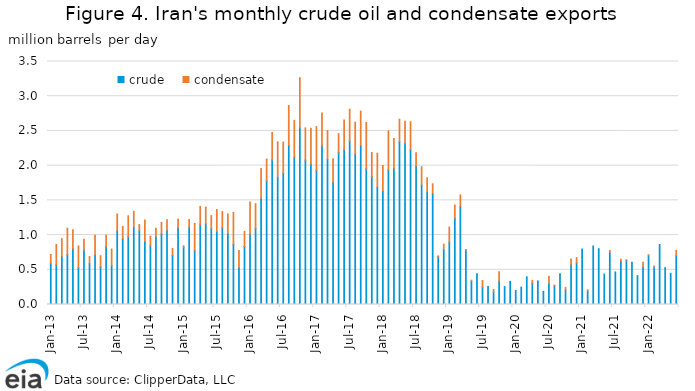
| Category | crude | condensate |
|---|---|---|
| 2013-01-01 | 0.588 | 0.132 |
| 2013-02-01 | 0.572 | 0.293 |
| 2013-03-01 | 0.693 | 0.255 |
| 2013-04-01 | 0.719 | 0.381 |
| 2013-05-01 | 0.801 | 0.275 |
| 2013-06-01 | 0.532 | 0.311 |
| 2013-07-01 | 0.788 | 0.152 |
| 2013-08-01 | 0.588 | 0.103 |
| 2013-09-01 | 0.717 | 0.282 |
| 2013-10-01 | 0.541 | 0.162 |
| 2013-11-01 | 0.832 | 0.165 |
| 2013-12-01 | 0.559 | 0.239 |
| 2014-01-01 | 1.065 | 0.239 |
| 2014-02-01 | 0.951 | 0.175 |
| 2014-03-01 | 0.978 | 0.3 |
| 2014-04-01 | 1.114 | 0.228 |
| 2014-05-01 | 1.069 | 0.083 |
| 2014-06-01 | 0.909 | 0.308 |
| 2014-07-01 | 0.843 | 0.141 |
| 2014-08-01 | 0.975 | 0.124 |
| 2014-09-01 | 1.018 | 0.164 |
| 2014-10-01 | 1.071 | 0.15 |
| 2014-11-01 | 0.708 | 0.099 |
| 2014-12-01 | 1.104 | 0.126 |
| 2015-01-01 | 0.822 | 0.024 |
| 2015-02-01 | 1.114 | 0.109 |
| 2015-03-01 | 0.778 | 0.389 |
| 2015-04-01 | 1.148 | 0.265 |
| 2015-05-01 | 1.161 | 0.243 |
| 2015-06-01 | 1.092 | 0.188 |
| 2015-07-01 | 1.05 | 0.318 |
| 2015-08-01 | 1.106 | 0.232 |
| 2015-09-01 | 1.023 | 0.281 |
| 2015-10-01 | 0.867 | 0.46 |
| 2015-11-01 | 0.531 | 0.247 |
| 2015-12-01 | 0.835 | 0.219 |
| 2016-01-01 | 1.016 | 0.459 |
| 2016-02-01 | 1.096 | 0.356 |
| 2016-03-01 | 1.531 | 0.428 |
| 2016-04-01 | 1.78 | 0.315 |
| 2016-05-01 | 2.083 | 0.395 |
| 2016-06-01 | 1.833 | 0.51 |
| 2016-07-01 | 1.891 | 0.448 |
| 2016-08-01 | 2.293 | 0.573 |
| 2016-09-01 | 2.121 | 0.531 |
| 2016-10-01 | 2.543 | 0.724 |
| 2016-11-01 | 2.079 | 0.464 |
| 2016-12-01 | 2.022 | 0.516 |
| 2017-01-01 | 1.932 | 0.631 |
| 2017-02-01 | 2.285 | 0.472 |
| 2017-03-01 | 2.091 | 0.415 |
| 2017-04-01 | 1.76 | 0.339 |
| 2017-05-01 | 2.191 | 0.269 |
| 2017-06-01 | 2.23 | 0.426 |
| 2017-07-01 | 2.355 | 0.457 |
| 2017-08-01 | 2.164 | 0.462 |
| 2017-09-01 | 2.287 | 0.499 |
| 2017-10-01 | 1.957 | 0.666 |
| 2017-11-01 | 1.842 | 0.347 |
| 2017-12-01 | 1.69 | 0.489 |
| 2018-01-01 | 1.634 | 0.366 |
| 2018-02-01 | 1.938 | 0.562 |
| 2018-03-01 | 1.958 | 0.432 |
| 2018-04-01 | 2.346 | 0.323 |
| 2018-05-01 | 2.322 | 0.317 |
| 2018-06-01 | 2.231 | 0.401 |
| 2018-07-01 | 1.993 | 0.193 |
| 2018-08-01 | 1.719 | 0.266 |
| 2018-09-01 | 1.622 | 0.204 |
| 2018-10-01 | 1.597 | 0.141 |
| 2018-11-01 | 0.69 | 0.011 |
| 2018-12-01 | 0.792 | 0.076 |
| 2019-01-01 | 0.9 | 0.216 |
| 2019-02-01 | 1.244 | 0.189 |
| 2019-03-01 | 1.413 | 0.166 |
| 2019-04-01 | 0.782 | 0.011 |
| 2019-05-01 | 0.332 | 0.019 |
| 2019-06-01 | 0.442 | 0 |
| 2019-07-01 | 0.252 | 0.094 |
| 2019-08-01 | 0.26 | 0 |
| 2019-09-01 | 0.179 | 0.04 |
| 2019-10-01 | 0.337 | 0.134 |
| 2019-11-01 | 0.258 | 0 |
| 2019-12-01 | 0.333 | 0 |
| 2020-01-01 | 0.202 | 0 |
| 2020-02-01 | 0.25 | 0 |
| 2020-03-01 | 0.399 | 0 |
| 2020-04-01 | 0.307 | 0.041 |
| 2020-05-01 | 0.339 | 0 |
| 2020-06-01 | 0.189 | 0 |
| 2020-07-01 | 0.303 | 0.104 |
| 2020-08-01 | 0.268 | 0.011 |
| 2020-09-01 | 0.444 | 0 |
| 2020-10-01 | 0.209 | 0.038 |
| 2020-11-01 | 0.577 | 0.079 |
| 2020-12-01 | 0.6 | 0.075 |
| 2021-01-01 | 0.8 | 0 |
| 2021-02-01 | 0.19 | 0.022 |
| 2021-03-01 | 0.843 | 0 |
| 2021-04-01 | 0.804 | 0 |
| 2021-05-01 | 0.438 | 0 |
| 2021-06-01 | 0.752 | 0.027 |
| 2021-07-01 | 0.469 | 0 |
| 2021-08-01 | 0.624 | 0.029 |
| 2021-09-01 | 0.636 | 0.007 |
| 2021-10-01 | 0.608 | 0 |
| 2021-11-01 | 0.415 | 0 |
| 2021-12-01 | 0.539 | 0.071 |
| 2022-01-01 | 0.7 | 0.017 |
| 2022-02-01 | 0.532 | 0.024 |
| 2022-03-01 | 0.864 | 0 |
| 2022-04-01 | 0.53 | 0 |
| 2022-05-01 | 0.449 | 0 |
| 2022-06-01 | 0.704 | 0.075 |